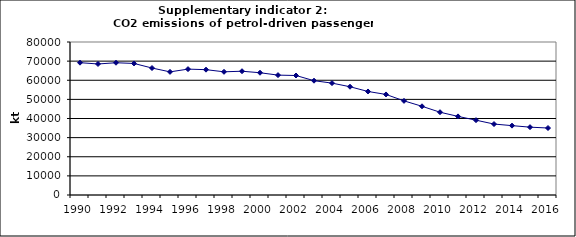
| Category | CO2 emissions of petrol-driven passenger cars, kt |
|---|---|
| 1990 | 69184.648 |
| 1991 | 68512.503 |
| 1992 | 69151.945 |
| 1993 | 68778.136 |
| 1994 | 66396.794 |
| 1995 | 64379.666 |
| 1996 | 65817.664 |
| 1997 | 65532.437 |
| 1998 | 64418.963 |
| 1999 | 64721.024 |
| 2000 | 63927.661 |
| 2001 | 62687.824 |
| 2002 | 62480.789 |
| 2003 | 59765.465 |
| 2004 | 58499.483 |
| 2005 | 56604.062 |
| 2006 | 54133.766 |
| 2007 | 52578.162 |
| 2008 | 49216.009 |
| 2009 | 46385.29 |
| 2010 | 43284.614 |
| 2011 | 41095.47 |
| 2012 | 39118.43 |
| 2013 | 37096.47 |
| 2014 | 36273.261 |
| 2015 | 35473.561 |
| 2016 | 35026.529 |